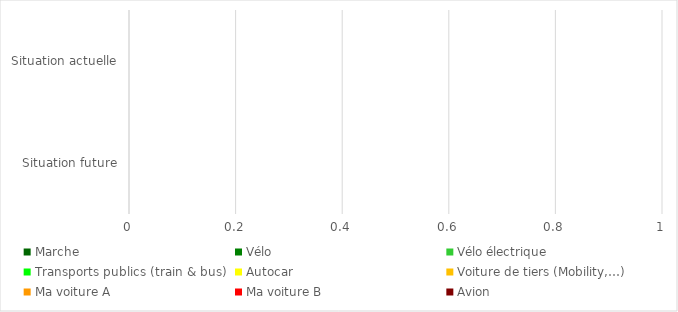
| Category | Marche | Vélo | Vélo électrique | Transports publics (train & bus) | Autocar | Voiture de tiers (Mobility,…) | Ma voiture A | Ma voiture B | Avion |
|---|---|---|---|---|---|---|---|---|---|
| Situation future | 0 | 0 | 0 | 0 | 0 | 0 | 0 | 0 | 0 |
| Situation actuelle | 0 | 0 | 0 | 0 | 0 | 0 | 0 | 0 | 0 |